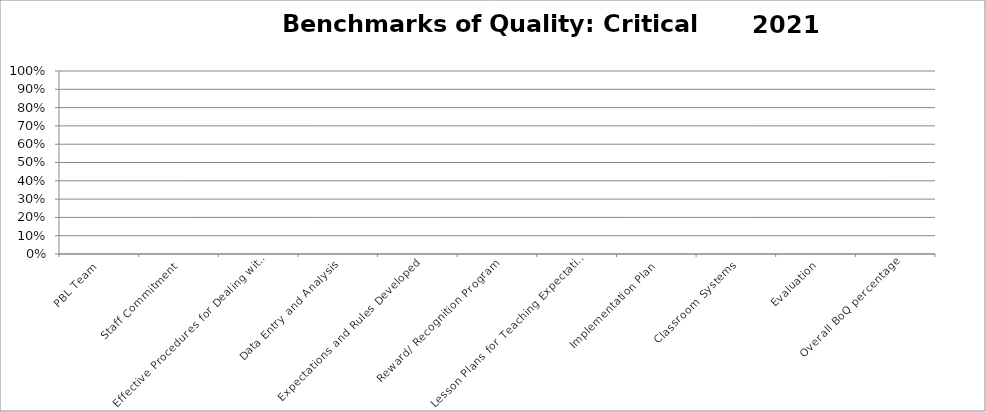
| Category | 2021 |
|---|---|
| PBL Team | 0 |
| Staff Commitment | 0 |
| Effective Procedures for Dealing with Discipline | 0 |
| Data Entry and Analysis | 0 |
| Expectations and Rules Developed | 0 |
| Reward/ Recognition Program | 0 |
| Lesson Plans for Teaching Expectations | 0 |
| Implementation Plan | 0 |
| Classroom Systems | 0 |
| Evaluation | 0 |
| Overall BoQ percentage | 0 |